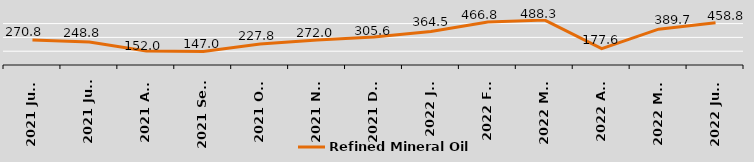
| Category | Refined Mineral Oil |
|---|---|
| 2021 June | 270.8 |
| 2021 July | 248.8 |
| 2021 Aug | 152 |
| 2021 Sept | 147 |
| 2021 Oct | 227.8 |
| 2021 Nov | 272 |
| 2021 Dec | 305.6 |
| 2022 Jan | 364.5 |
| 2022 Feb | 466.8 |
| 2022 Mar | 488.3 |
| 2022 Apr | 177.6 |
| 2022 May | 389.7 |
| 2022 June | 458.8 |